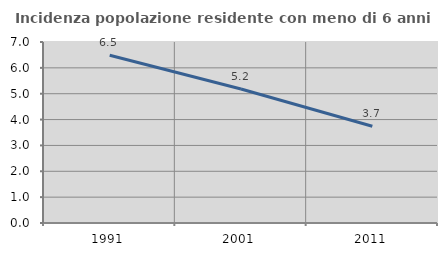
| Category | Incidenza popolazione residente con meno di 6 anni |
|---|---|
| 1991.0 | 6.487 |
| 2001.0 | 5.181 |
| 2011.0 | 3.743 |